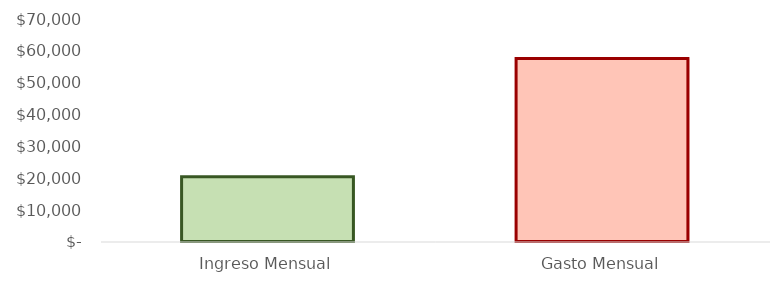
| Category | Series 0 |
|---|---|
| Ingreso Mensual | 20500 |
| Gasto Mensual | 57637 |